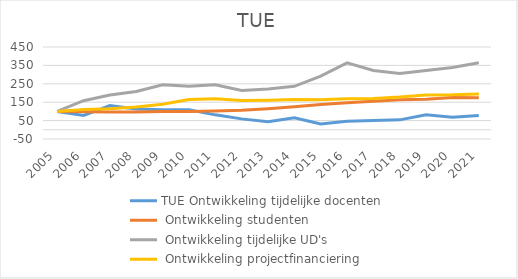
| Category | TUE |
|---|---|
| 2005.0 | 100 |
| 2006.0 | 110.616 |
| 2007.0 | 114.041 |
| 2008.0 | 123.973 |
| 2009.0 | 138.527 |
| 2010.0 | 165.068 |
| 2011.0 | 168.836 |
| 2012.0 | 159.589 |
| 2013.0 | 161.13 |
| 2014.0 | 164.897 |
| 2015.0 | 163.87 |
| 2016.0 | 168.493 |
| 2017.0 | 169.863 |
| 2018.0 | 177.911 |
| 2019.0 | 189.212 |
| 2020.0 | 190.24 |
| 2021.0 | 194.863 |